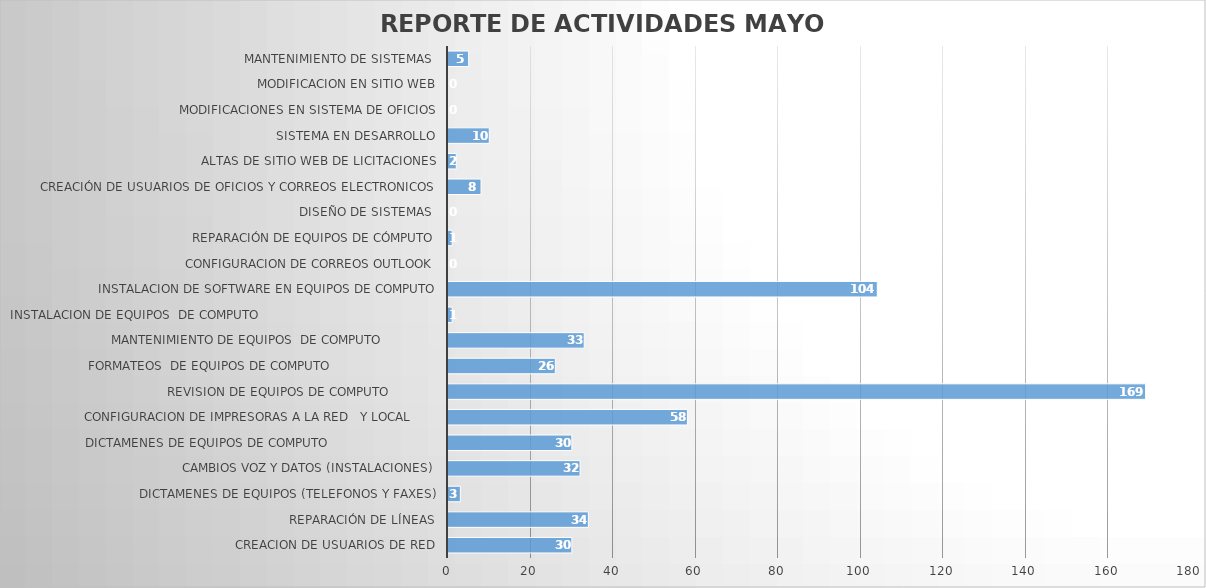
| Category | abr-22 |
|---|---|
| CREACION DE USUARIOS DE RED | 30 |
| REPARACIÓN DE LÍNEAS | 34 |
| DICTAMENES DE EQUIPOS (TELEFONOS Y FAXES) | 3 |
| CAMBIOS VOZ Y DATOS (INSTALACIONES) | 32 |
| DICTAMENES DE EQUIPOS DE COMPUTO                             | 30 |
| CONFIGURACION DE IMPRESORAS A LA RED   Y LOCAL       | 58 |
| REVISION DE EQUIPOS DE COMPUTO             | 169 |
| FORMATEOS  DE EQUIPOS DE COMPUTO                            | 26 |
| MANTENIMIENTO DE EQUIPOS  DE COMPUTO               | 33 |
| INSTALACION DE EQUIPOS  DE COMPUTO                                               | 1 |
| INSTALACION DE SOFTWARE EN EQUIPOS DE COMPUTO | 104 |
| CONFIGURACION DE CORREOS OUTLOOK | 0 |
| REPARACIÓN DE EQUIPOS DE CÓMPUTO | 1 |
| DISEÑO DE SISTEMAS  | 0 |
| CREACIÓN DE USUARIOS DE OFICIOS Y CORREOS ELECTRONICOS | 8 |
| ALTAS DE SITIO WEB DE LICITACIONES | 2 |
| SISTEMA EN DESARROLLO | 10 |
| MODIFICACIONES EN SISTEMA DE OFICIOS | 0 |
| MODIFICACION EN SITIO WEB | 0 |
| MANTENIMIENTO DE SISTEMAS  | 5 |